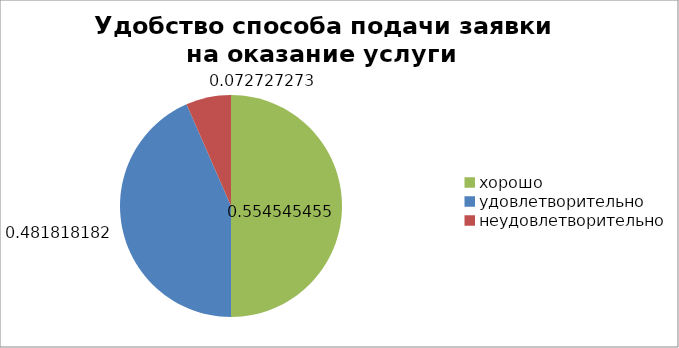
| Category | Series 0 |
|---|---|
| хорошо | 0.555 |
| удовлетворительно | 0.482 |
| неудовлетворительно | 0.073 |